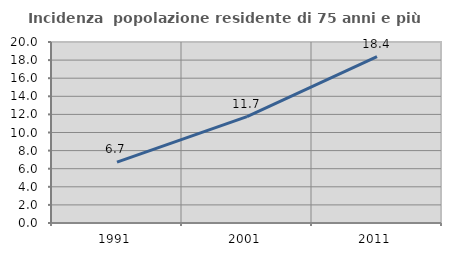
| Category | Incidenza  popolazione residente di 75 anni e più |
|---|---|
| 1991.0 | 6.729 |
| 2001.0 | 11.749 |
| 2011.0 | 18.384 |